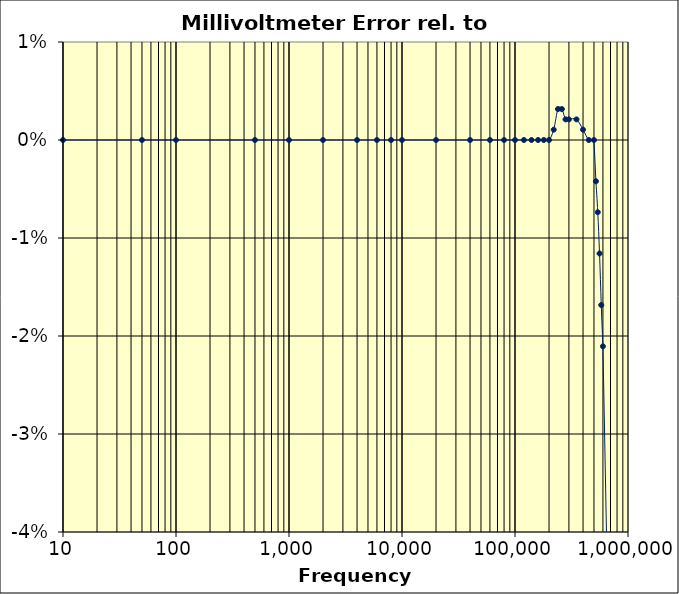
| Category | Series 0 |
|---|---|
| 10.0 | 0 |
| 50.0 | 0 |
| 100.0 | 0 |
| 500.0 | 0 |
| 1000.0 | 0 |
| 2000.0 | 0 |
| 4000.0 | 0 |
| 6000.0 | 0 |
| 8000.0 | 0 |
| 10000.0 | 0 |
| 20000.0 | 0 |
| 40000.0 | 0 |
| 60000.0 | 0 |
| 80000.0 | 0 |
| 100000.0 | 0 |
| 120000.0 | 0 |
| 140000.0 | 0 |
| 160000.0 | 0 |
| 180000.0 | 0 |
| 200000.0 | 0 |
| 220000.0 | 0.001 |
| 240000.0 | 0.003 |
| 260000.0 | 0.003 |
| 280000.0 | 0.002 |
| 300000.0 | 0.002 |
| 350000.0 | 0.002 |
| 400000.0 | 0.001 |
| 450000.0 | 0 |
| 500000.0 | 0 |
| 520000.0 | -0.004 |
| 540000.0 | -0.007 |
| 560000.0 | -0.012 |
| 580000.0 | -0.017 |
| 600000.0 | -0.021 |
| 650000.0 | -0.042 |
| 700000.0 | -0.063 |